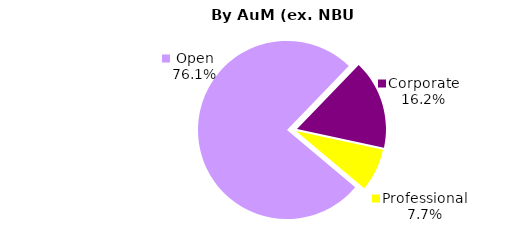
| Category | Series 0 |
|---|---|
| Open | 1518.668 |
| Corporate | 322.906 |
| Professional | 154.367 |